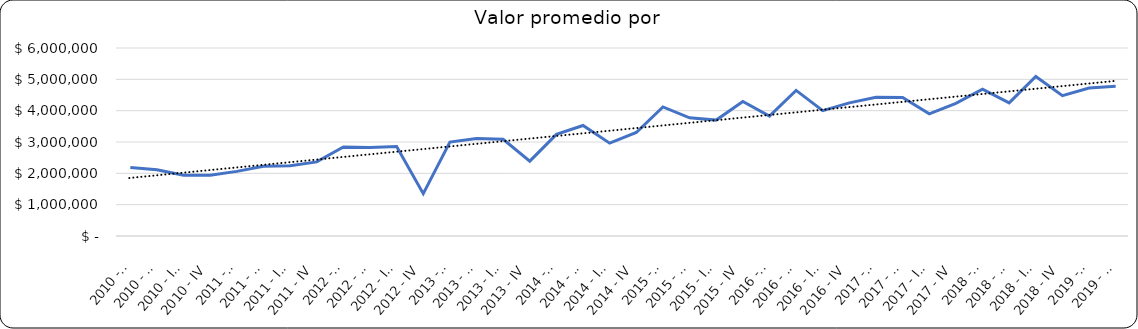
| Category | Valor m2 en Bogotá por sectores |
|---|---|
| 2010 - I | 2187500 |
| 2010 - II | 2112500 |
| 2010 - III | 1937500 |
| 2010 - IV | 1941666.667 |
| 2011 - I | 2062500 |
| 2011 - II | 2222916.667 |
| 2011 - III | 2239583.333 |
| 2011 - IV | 2364583.333 |
| 2012 - I | 2843881.857 |
| 2012 - II | 2827004.219 |
| 2012 - III | 2856540.084 |
| 2012 - IV | 1352531.646 |
| 2013 - I | 2999572.65 |
| 2013 - II | 3108974.359 |
| 2013 - III | 3085470.085 |
| 2013 - IV | 2388888.889 |
| 2014 - I | 3244047.619 |
| 2014 - II | 3527777.778 |
| 2014 - III | 2962301.587 |
| 2014 - IV | 3303571.429 |
| 2015 - I | 4120370.37 |
| 2015 - II | 3773148.148 |
| 2015 - III | 3699074.074 |
| 2015 - IV | 4293981.481 |
| 2016 - I | 3827519.38 |
| 2016 - II | 4648148.148 |
| 2016 - III | 4002604.167 |
| 2016 - IV | 4247863.248 |
| 2017 - I | 4429824.561 |
| 2017 - II | 4423076.923 |
| 2017 - III | 3900000 |
| 2017 - IV | 4235294 |
| 2018 - I | 4687500 |
| 2018 - II | 4248554.913 |
| 2018 - III | 5089744 |
| 2018 - IV | 4479167 |
| 2019 - I | 4720497 |
| 2019 - II | 4777778 |